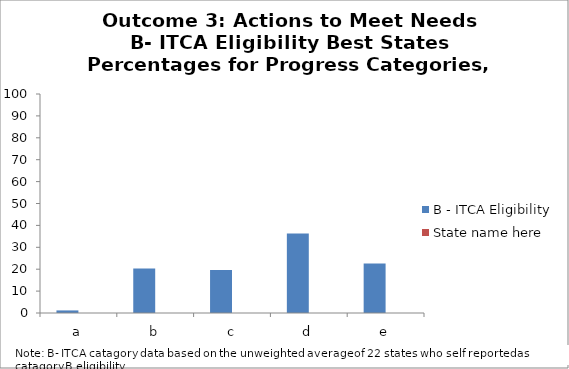
| Category | B - ITCA Eligibility | State name here |
|---|---|---|
| a | 1.18 |  |
| b | 20.3 |  |
| c | 19.6 |  |
| d | 36.34 |  |
| e | 22.6 |  |